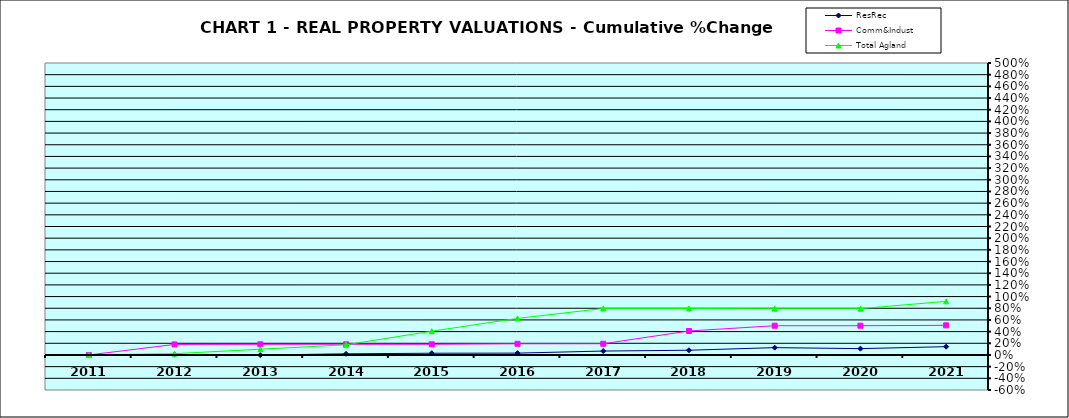
| Category | ResRec | Comm&Indust | Total Agland |
|---|---|---|---|
| 2011.0 | 0 | 0 | 0 |
| 2012.0 | 0.008 | 0.18 | 0.022 |
| 2013.0 | -0.002 | 0.183 | 0.099 |
| 2014.0 | 0.02 | 0.183 | 0.174 |
| 2015.0 | 0.03 | 0.183 | 0.407 |
| 2016.0 | 0.032 | 0.191 | 0.626 |
| 2017.0 | 0.067 | 0.192 | 0.796 |
| 2018.0 | 0.081 | 0.411 | 0.796 |
| 2019.0 | 0.125 | 0.501 | 0.793 |
| 2020.0 | 0.109 | 0.501 | 0.793 |
| 2021.0 | 0.142 | 0.508 | 0.918 |